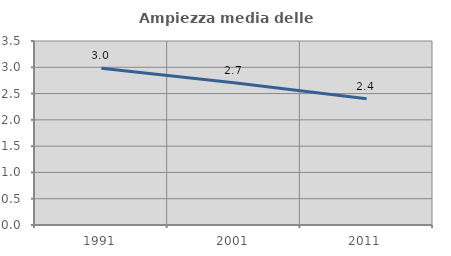
| Category | Ampiezza media delle famiglie |
|---|---|
| 1991.0 | 2.984 |
| 2001.0 | 2.706 |
| 2011.0 | 2.404 |